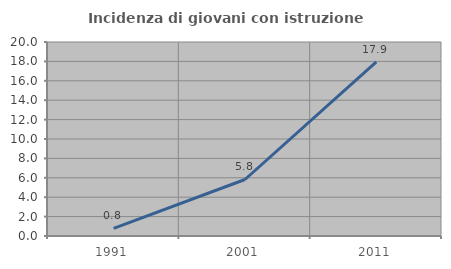
| Category | Incidenza di giovani con istruzione universitaria |
|---|---|
| 1991.0 | 0.787 |
| 2001.0 | 5.825 |
| 2011.0 | 17.949 |